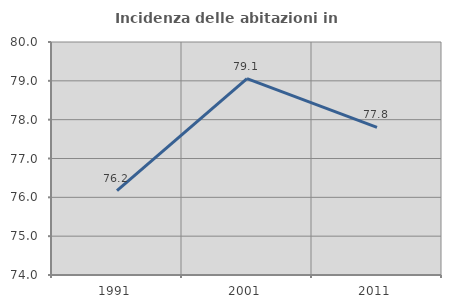
| Category | Incidenza delle abitazioni in proprietà  |
|---|---|
| 1991.0 | 76.174 |
| 2001.0 | 79.055 |
| 2011.0 | 77.799 |